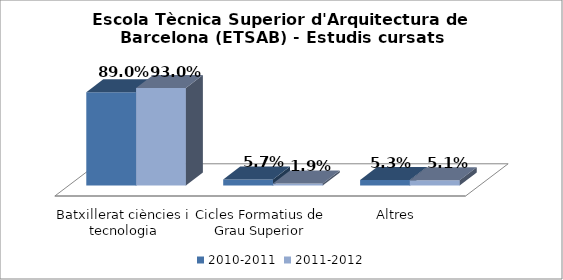
| Category | 2010-2011 | 2011-2012 |
|---|---|---|
| Batxillerat ciències i tecnologia | 0.89 | 0.93 |
| Cicles Formatius de Grau Superior | 0.057 | 0.019 |
| Altres | 0.053 | 0.051 |